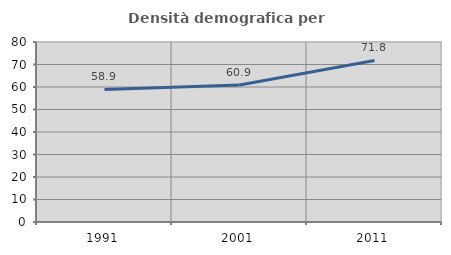
| Category | Densità demografica |
|---|---|
| 1991.0 | 58.902 |
| 2001.0 | 60.855 |
| 2011.0 | 71.803 |